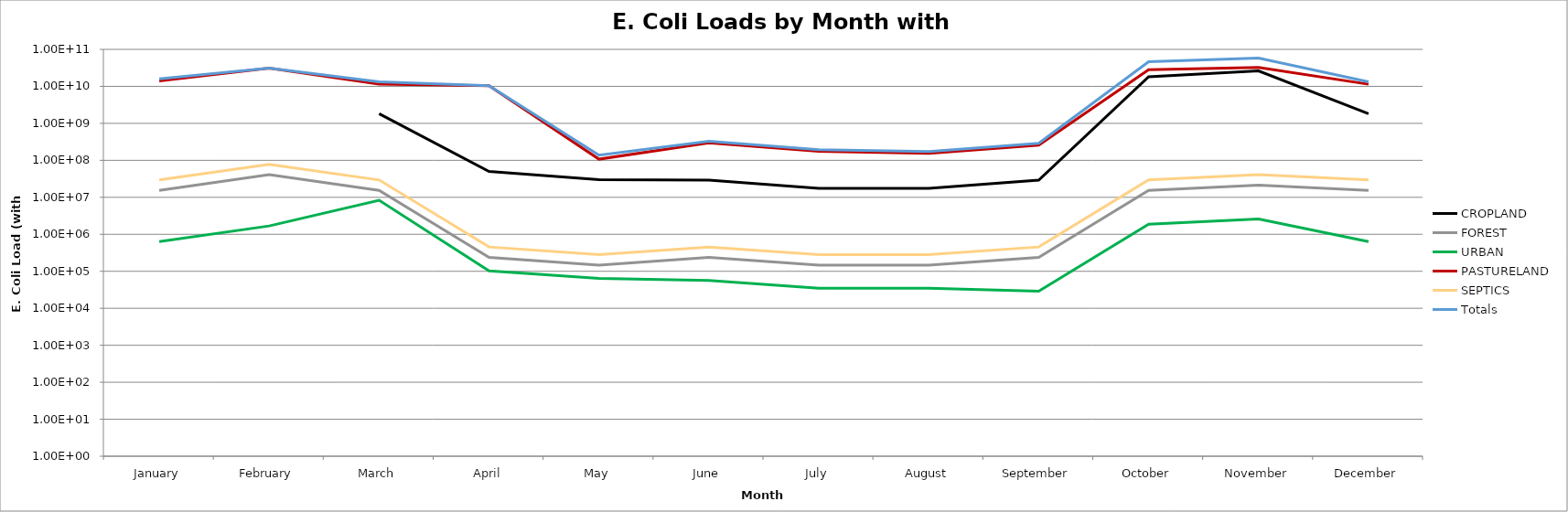
| Category | CROPLAND | FOREST | URBAN | PASTURELAND | SEPTICS | Totals |
|---|---|---|---|---|---|---|
| January | 1821971138.755 | 15425480.515 | 632586.914 | 14068955081.804 | 29457761.417 | 15936442049.404 |
| February | 0 | 41027313.453 | 1682498.096 | 30903964193.271 | 78349119.18 | 31025023124 |
| March | 1821971138.755 | 15425480.515 | 8318336.584 | 11418384381.641 | 29457761.417 | 13293557098.911 |
| April | 49913238.001 | 237694.486 | 102347.562 | 10409882821.799 | 453920.865 | 10460590022.714 |
| May | 29952378.809 | 147492.304 | 64559.031 | 107570078.86 | 281663.388 | 138016172.392 |
| June | 29025788.763 | 237694.486 | 56269.334 | 296268876.875 | 453920.865 | 326042550.323 |
| July | 17420962.758 | 147492.304 | 34915.802 | 175585924.704 | 281663.388 | 193470958.956 |
| August | 17420962.758 | 147492.304 | 34915.802 | 155055962.665 | 281663.388 | 172940996.918 |
| September | 29025788.763 | 237694.486 | 28880.332 | 258081455.86 | 453920.865 | 287827740.306 |
| October | 18182761694.075 | 15425480.515 | 1874225.207 | 28094092687.616 | 29457761.417 | 46323611848.829 |
| November | 26084691744.014 | 21396575.763 | 2599724.631 | 32337690219.028 | 40860654.122 | 58487238917.557 |
| December | 1821971138.755 | 15425480.515 | 632586.914 | 11418384381.641 | 29457761.417 | 13285871349.241 |